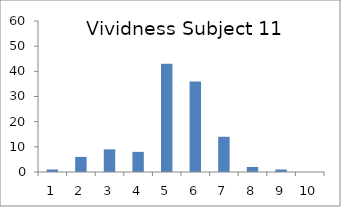
| Category | Frequency |
|---|---|
| 0 | 1 |
| 1 | 6 |
| 2 | 9 |
| 3 | 8 |
| 4 | 43 |
| 5 | 36 |
| 6 | 14 |
| 7 | 2 |
| 8 | 1 |
| 9 | 0 |